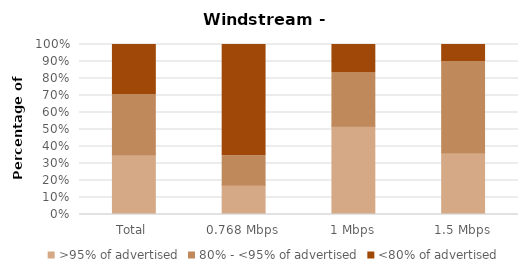
| Category | >95% of advertised | 80% - <95% of advertised | <80% of advertised |
|---|---|---|---|
| Total | 0.351 | 0.355 | 0.293 |
| 0.768 Mbps | 0.173 | 0.173 | 0.654 |
| 1 Mbps | 0.519 | 0.316 | 0.165 |
| 1.5 Mbps | 0.364 | 0.535 | 0.101 |